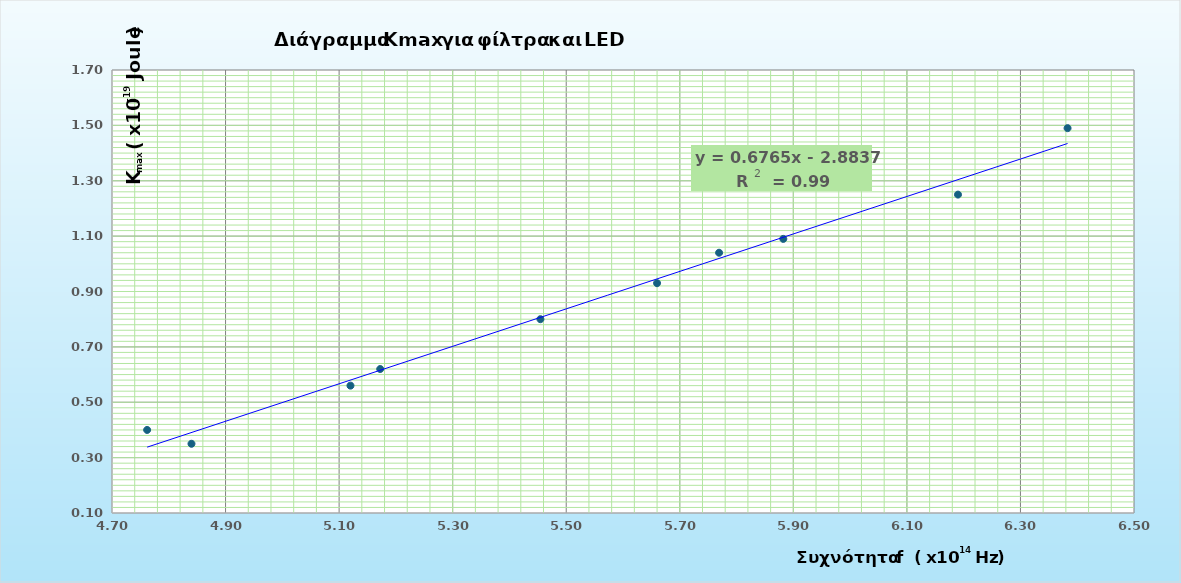
| Category | Kmax (x10^-19 Joule) (Kmax =qe*V) |
|---|---|
| 4.76190476190476 | 0.4 |
| 5.17241379310345 | 0.62 |
| 5.45454545454545 | 0.8 |
| 5.88235294117647 | 1.09 |
| 5.76923076923077 | 1.04 |
| 6.38297872340426 | 1.49 |
| 4.84 | 0.35 |
| 5.12 | 0.56 |
| 5.66 | 0.93 |
| 6.19 | 1.25 |